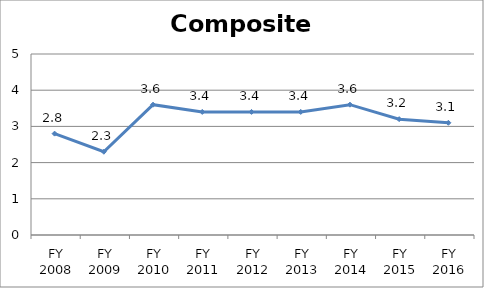
| Category | Composite score |
|---|---|
| FY 2016 | 3.1 |
| FY 2015 | 3.2 |
| FY 2014 | 3.6 |
| FY 2013 | 3.4 |
| FY 2012 | 3.4 |
| FY 2011 | 3.4 |
| FY 2010 | 3.6 |
| FY 2009 | 2.3 |
| FY 2008 | 2.8 |